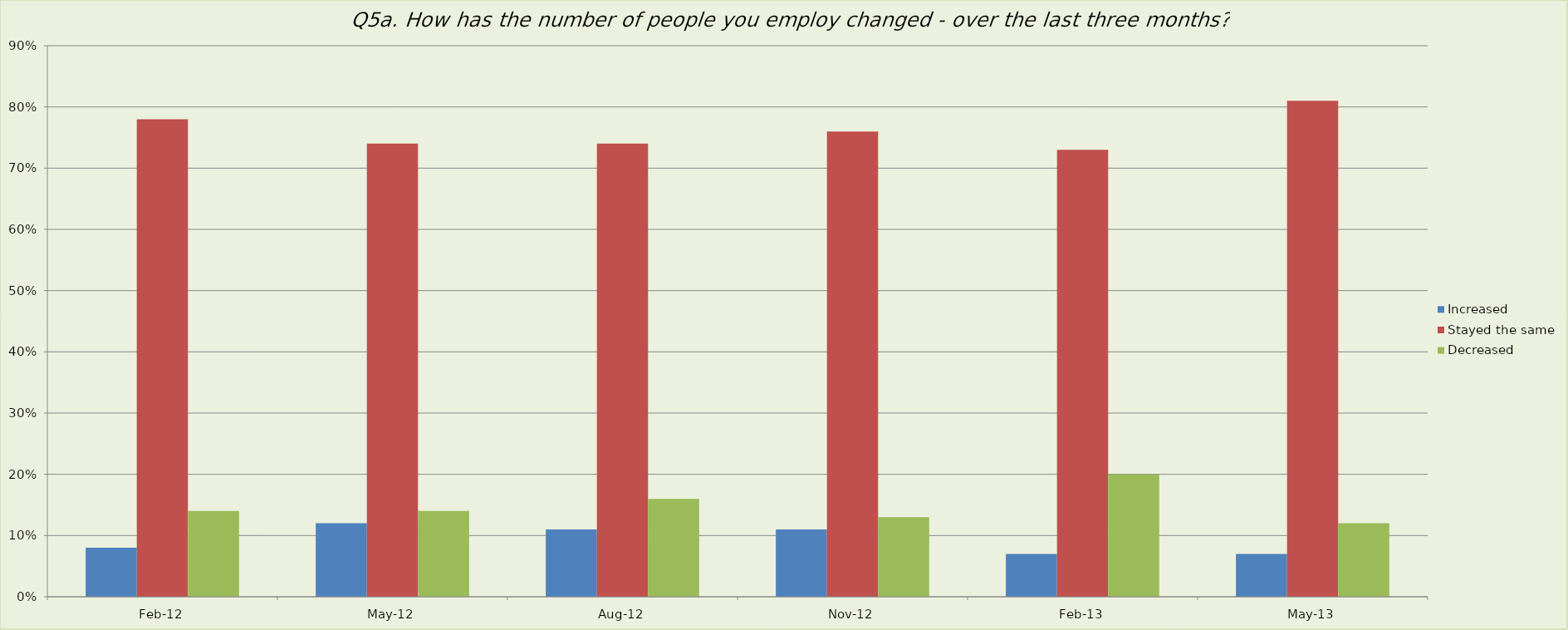
| Category | Increased | Stayed the same | Decreased |
|---|---|---|---|
| 2012-02-01 | 0.08 | 0.78 | 0.14 |
| 2012-05-01 | 0.12 | 0.74 | 0.14 |
| 2012-08-01 | 0.11 | 0.74 | 0.16 |
| 2012-11-01 | 0.11 | 0.76 | 0.13 |
| 2013-02-01 | 0.07 | 0.73 | 0.2 |
| 2013-05-01 | 0.07 | 0.81 | 0.12 |